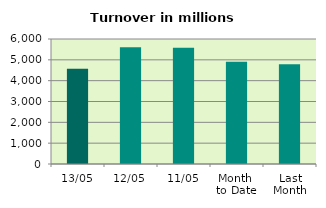
| Category | Series 0 |
|---|---|
| 13/05 | 4573.193 |
| 12/05 | 5600.742 |
| 11/05 | 5583.222 |
| Month 
to Date | 4911.44 |
| Last
Month | 4785.141 |